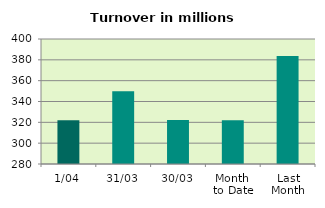
| Category | Series 0 |
|---|---|
| 1/04 | 322.085 |
| 31/03 | 349.81 |
| 30/03 | 322.13 |
| Month 
to Date | 322.085 |
| Last
Month | 383.695 |